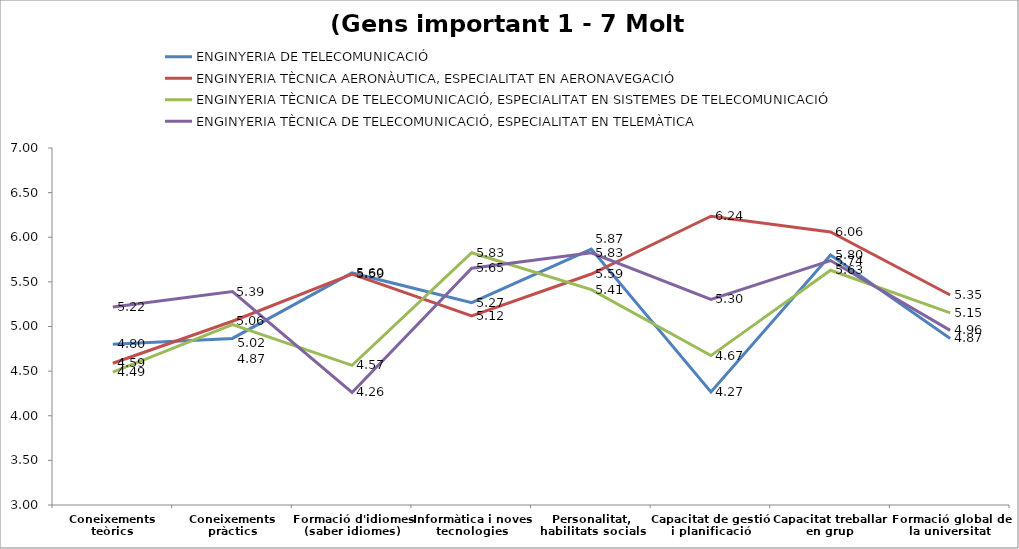
| Category | ENGINYERIA DE TELECOMUNICACIÓ | ENGINYERIA TÈCNICA AERONÀUTICA, ESPECIALITAT EN AERONAVEGACIÓ | ENGINYERIA TÈCNICA DE TELECOMUNICACIÓ, ESPECIALITAT EN SISTEMES DE TELECOMUNICACIÓ | ENGINYERIA TÈCNICA DE TELECOMUNICACIÓ, ESPECIALITAT EN TELEMÀTICA |
|---|---|---|---|---|
| Coneixements teòrics | 4.8 | 4.588 | 4.489 | 5.217 |
| Coneixements pràctics | 4.867 | 5.059 | 5.022 | 5.391 |
| Formació d'idiomes (saber idiomes) | 5.6 | 5.588 | 4.565 | 4.261 |
| Informàtica i noves tecnologies | 5.267 | 5.118 | 5.826 | 5.652 |
| Personalitat, habilitats socials | 5.867 | 5.588 | 5.413 | 5.826 |
| Capacitat de gestió i planificació | 4.267 | 6.235 | 4.674 | 5.304 |
| Capacitat treballar en grup | 5.8 | 6.059 | 5.63 | 5.739 |
| Formació global de la universitat | 4.867 | 5.353 | 5.152 | 4.957 |